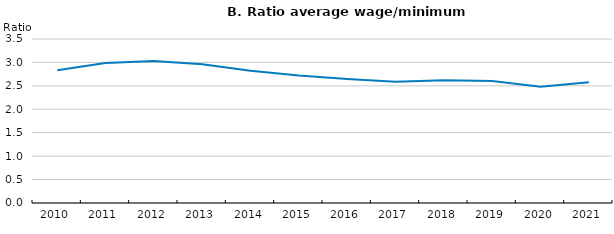
| Category | Ratio average wage/minimum wage |
|---|---|
| 2010.0 | 2.835 |
| 2011.0 | 2.988 |
| 2012.0 | 3.033 |
| 2013.0 | 2.962 |
| 2014.0 | 2.82 |
| 2015.0 | 2.719 |
| 2016.0 | 2.648 |
| 2017.0 | 2.589 |
| 2018.0 | 2.619 |
| 2019.0 | 2.606 |
| 2020.0 | 2.48 |
| 2021.0 | 2.578 |